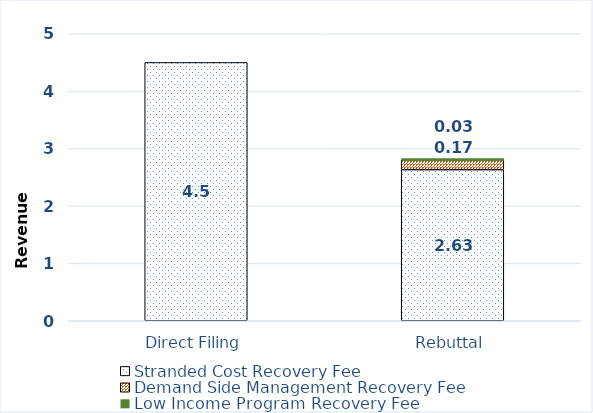
| Category | Stranded Cost Recovery Fee | Demand Side Management Recovery Fee | Low Income Program Recovery Fee |
|---|---|---|---|
| Direct Filing | 4.5 | 0 | 0 |
| Rebuttal | 2.633 | 0.173 | 0.029 |